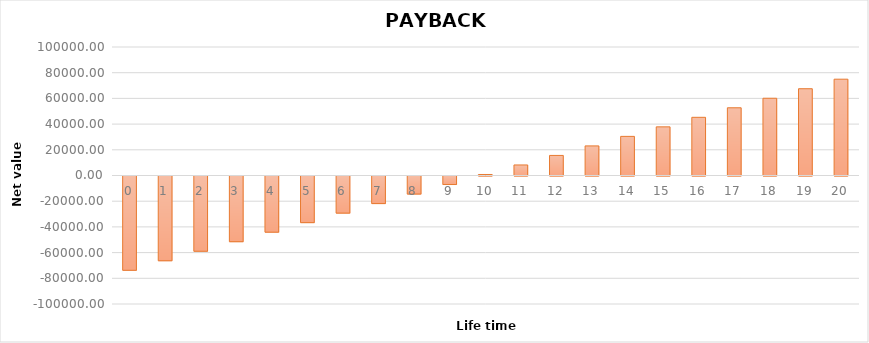
| Category | PAYBACK PERIOD |
|---|---|
| 0.0 | -73388.847 |
| 1.0 | -65972.027 |
| 2.0 | -58555.206 |
| 3.0 | -51138.386 |
| 4.0 | -43721.565 |
| 5.0 | -36304.744 |
| 6.0 | -28887.924 |
| 7.0 | -21471.103 |
| 8.0 | -14054.283 |
| 9.0 | -6637.462 |
| 10.0 | 779.359 |
| 11.0 | 8196.179 |
| 12.0 | 15613 |
| 13.0 | 23029.82 |
| 14.0 | 30446.641 |
| 15.0 | 37863.461 |
| 16.0 | 45280.282 |
| 17.0 | 52697.103 |
| 18.0 | 60113.923 |
| 19.0 | 67530.744 |
| 20.0 | 74947.564 |